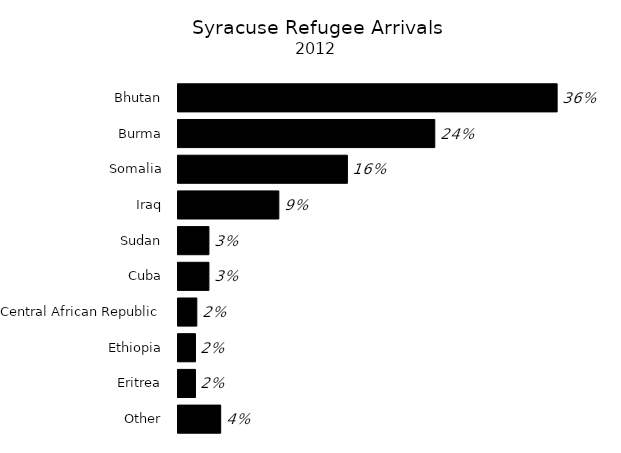
| Category | Series 0 |
|---|---|
| Other | 0.04 |
| Eritrea | 0.016 |
| Ethiopia | 0.016 |
| Central African Republic | 0.018 |
| Cuba | 0.029 |
| Sudan | 0.029 |
| Iraq | 0.094 |
| Somalia | 0.159 |
| Burma | 0.241 |
| Bhutan | 0.355 |